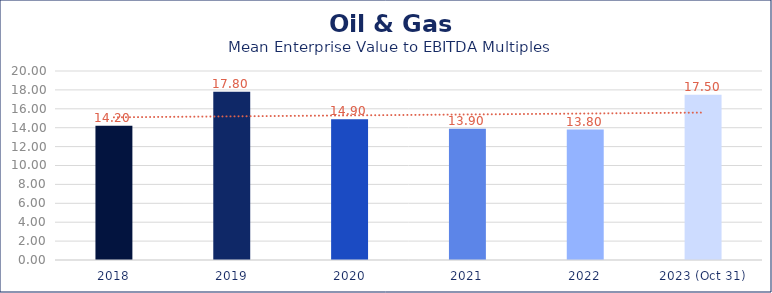
| Category | Oil & Gas |
|---|---|
| 2018 | 14.2 |
| 2019 | 17.8 |
| 2020 | 14.9 |
| 2021 | 13.9 |
| 2022 | 13.8 |
| 2023 (Oct 31) | 17.5 |